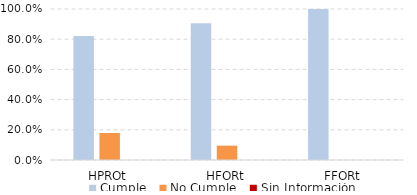
| Category | Cumple | No Cumple | Sin Información |
|---|---|---|---|
| HPROt | 0.821 | 0.179 | 0 |
| HFORt | 0.905 | 0.095 | 0 |
| FFORt | 1 | 0 | 0 |